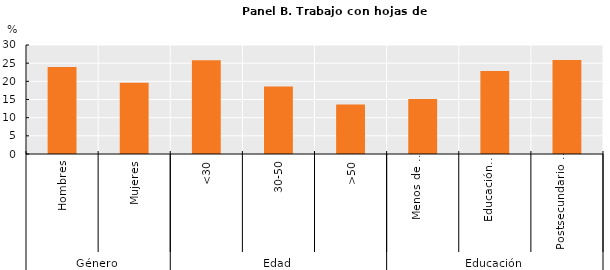
| Category | Trabajo con hojas de cálculo |
|---|---|
| 0 | 23.931 |
| 1 | 19.639 |
| 2 | 25.833 |
| 3 | 18.581 |
| 4 | 13.648 |
| 5 | 15.15 |
| 6 | 22.873 |
| 7 | 25.906 |